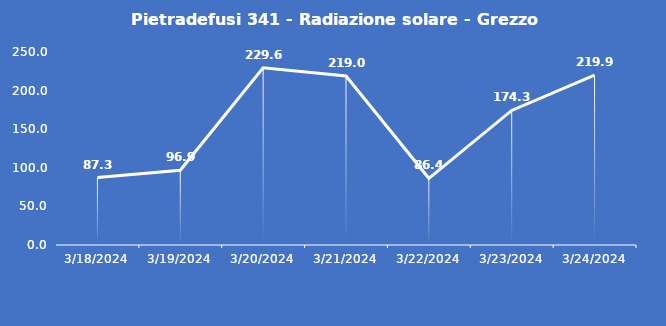
| Category | Pietradefusi 341 - Radiazione solare - Grezzo (W/m2) |
|---|---|
| 3/18/24 | 87.3 |
| 3/19/24 | 96.9 |
| 3/20/24 | 229.6 |
| 3/21/24 | 219 |
| 3/22/24 | 86.4 |
| 3/23/24 | 174.3 |
| 3/24/24 | 219.9 |